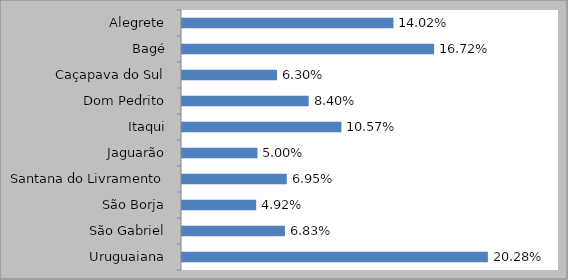
| Category | MATRIZ 2015
(% de Alunos Equivalentes) |
|---|---|
| Alegrete | 0.14 |
| Bagé | 0.167 |
| Caçapava do Sul | 0.063 |
| Dom Pedrito | 0.084 |
| Itaqui | 0.106 |
| Jaguarão | 0.05 |
| Santana do Livramento | 0.069 |
| São Borja | 0.049 |
| São Gabriel | 0.068 |
| Uruguaiana | 0.203 |